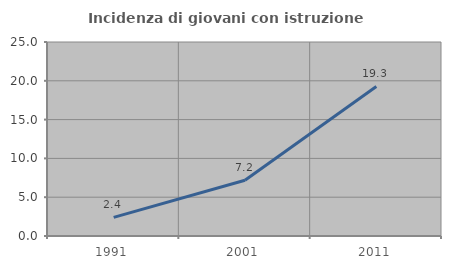
| Category | Incidenza di giovani con istruzione universitaria |
|---|---|
| 1991.0 | 2.406 |
| 2001.0 | 7.191 |
| 2011.0 | 19.269 |